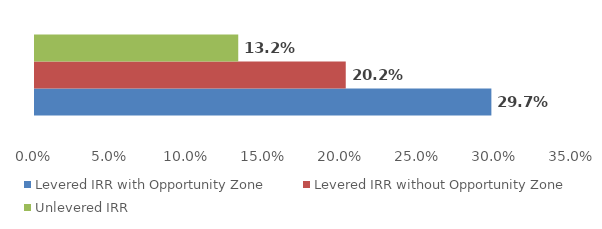
| Category | Levered IRR with Opportunity Zone | Levered IRR without Opportunity Zone | Unlevered IRR |
|---|---|---|---|
| 0 | 0.297 | 0.202 | 0.132 |